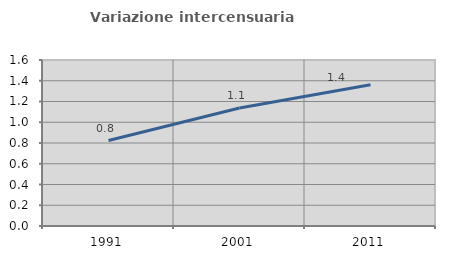
| Category | Variazione intercensuaria annua |
|---|---|
| 1991.0 | 0.824 |
| 2001.0 | 1.137 |
| 2011.0 | 1.361 |